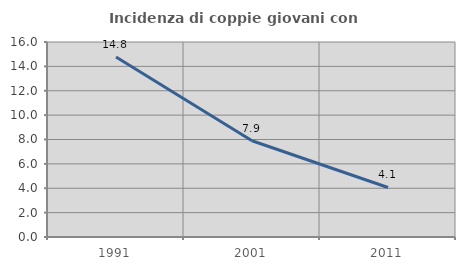
| Category | Incidenza di coppie giovani con figli |
|---|---|
| 1991.0 | 14.773 |
| 2001.0 | 7.895 |
| 2011.0 | 4.062 |